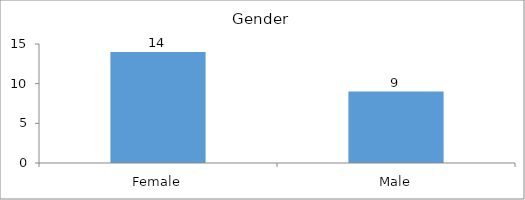
| Category | Gender |
|---|---|
| Female | 14 |
| Male | 9 |